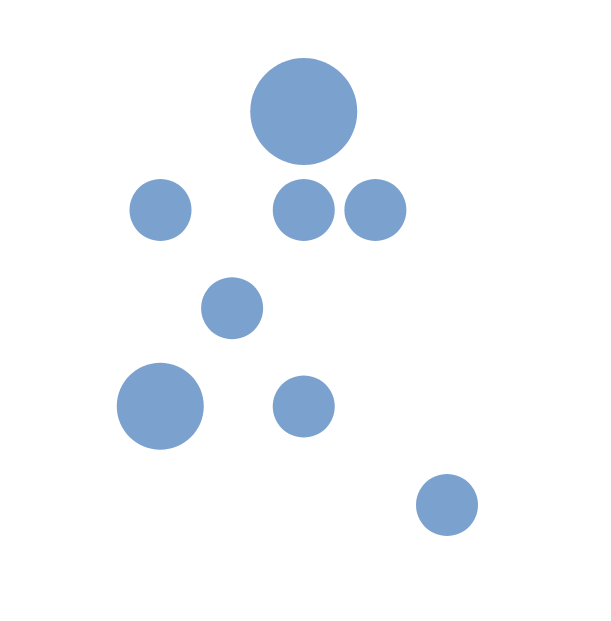
| Category | Series 0 |
|---|---|
| 1.0 | 1 |
| 2.0 | 1 |
| 3.0 | 1 |
| 4.0 | 1 |
| 5.0 | 1 |
| 1.0 | 2 |
| 2.0 | 2 |
| 3.0 | 2 |
| 4.0 | 2 |
| 5.0 | 2 |
| 1.0 | 3 |
| 2.0 | 3 |
| 3.0 | 3 |
| 4.0 | 3 |
| 5.0 | 3 |
| 1.0 | 4 |
| 2.0 | 4 |
| 3.0 | 4 |
| 4.0 | 4 |
| 5.0 | 4 |
| 1.0 | 5 |
| 2.0 | 5 |
| 3.0 | 5 |
| 4.0 | 5 |
| 5.0 | 5 |